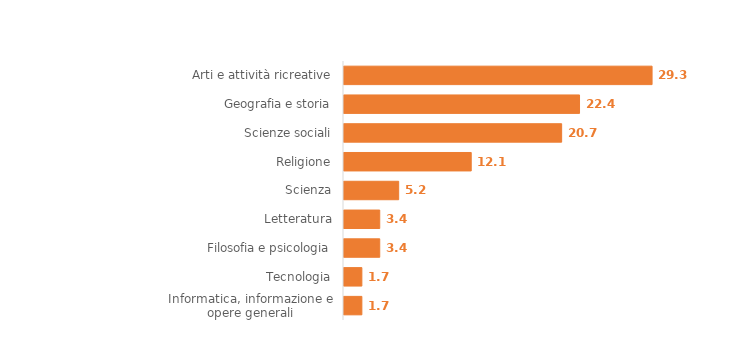
| Category | Series 0 |
|---|---|
| Informatica, informazione e opere generali | 1.7 |
| Tecnologia | 1.7 |
| Filosofia e psicologia | 3.4 |
| Letteratura | 3.4 |
| Scienza | 5.2 |
| Religione | 12.1 |
| Scienze sociali | 20.7 |
| Geografia e storia | 22.4 |
| Arti e attività ricreative | 29.3 |